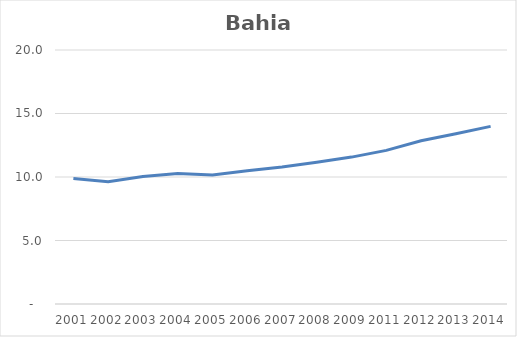
| Category | Total |
|---|---|
| 2001.0 | 9.882 |
| 2002.0 | 9.632 |
| 2003.0 | 10.047 |
| 2004.0 | 10.269 |
| 2005.0 | 10.161 |
| 2006.0 | 10.496 |
| 2007.0 | 10.792 |
| 2008.0 | 11.156 |
| 2009.0 | 11.567 |
| 2011.0 | 12.097 |
| 2012.0 | 12.857 |
| 2013.0 | 13.41 |
| 2014.0 | 13.986 |